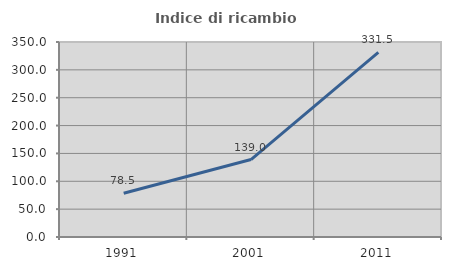
| Category | Indice di ricambio occupazionale  |
|---|---|
| 1991.0 | 78.523 |
| 2001.0 | 139.024 |
| 2011.0 | 331.481 |